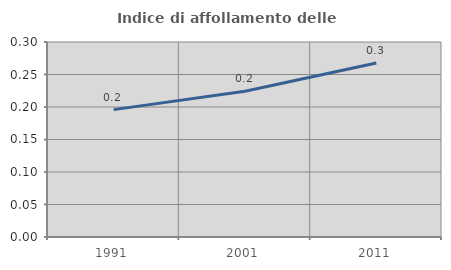
| Category | Indice di affollamento delle abitazioni  |
|---|---|
| 1991.0 | 0.196 |
| 2001.0 | 0.224 |
| 2011.0 | 0.268 |